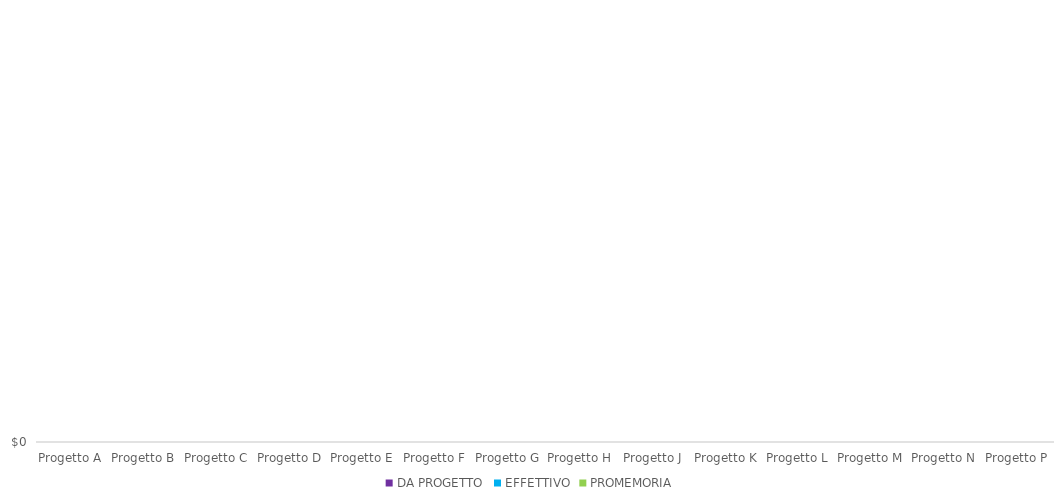
| Category | DA PROGETTO | EFFETTIVO | PROMEMORIA |
|---|---|---|---|
| Progetto A |  |  | 0 |
| Progetto B |  |  | 0 |
| Progetto C |  |  | 0 |
| Progetto D |  |  | 0 |
| Progetto E |  |  | 0 |
| Progetto F |  |  | 0 |
| Progetto G |  |  | 0 |
| Progetto H |  |  | 0 |
| Progetto J |  |  | 0 |
| Progetto K |  |  | 0 |
| Progetto L |  |  | 0 |
| Progetto M |  |  | 0 |
| Progetto N |  |  | 0 |
| Progetto P |  |  | 0 |